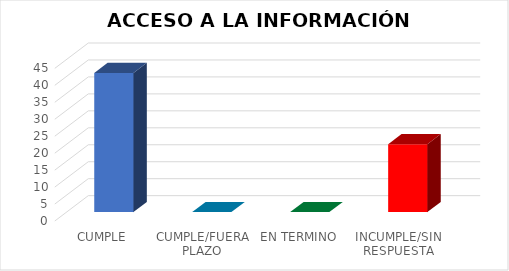
| Category | Series 0 |
|---|---|
| CUMPLE | 41 |
| CUMPLE/FUERA PLAZO | 0 |
| EN TERMINO | 0 |
| INCUMPLE/SIN RESPUESTA | 20 |